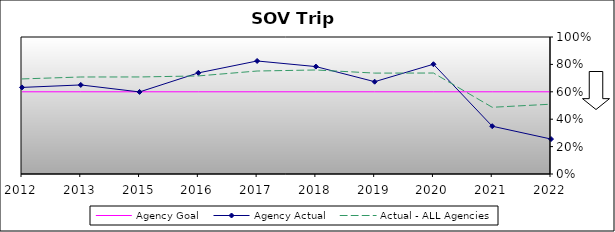
| Category | Agency Goal | Agency Actual | Actual - ALL Agencies |
|---|---|---|---|
| 2012.0 | 0.6 | 0.632 | 0.694 |
| 2013.0 | 0.6 | 0.65 | 0.708 |
| 2015.0 | 0.6 | 0.599 | 0.708 |
| 2016.0 | 0.6 | 0.738 | 0.716 |
| 2017.0 | 0.6 | 0.825 | 0.752 |
| 2018.0 | 0.6 | 0.784 | 0.759 |
| 2019.0 | 0.6 | 0.674 | 0.736 |
| 2020.0 | 0.6 | 0.801 | 0.737 |
| 2021.0 | 0.6 | 0.349 | 0.487 |
| 2022.0 | 0.6 | 0.255 | 0.509 |